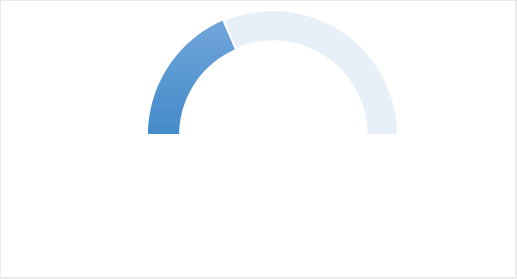
| Category | Series 0 |
|---|---|
| 0 | 0.37 |
| 1 | 0.63 |
| 2 | 1 |